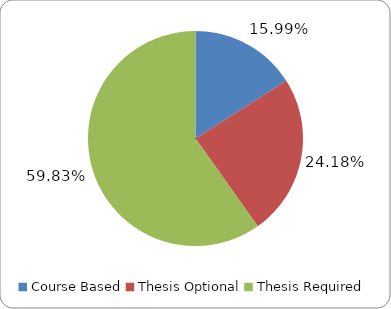
| Category | Total |
|---|---|
| Course Based | 0.16 |
| Thesis Optional | 0.242 |
| Thesis Required | 0.598 |